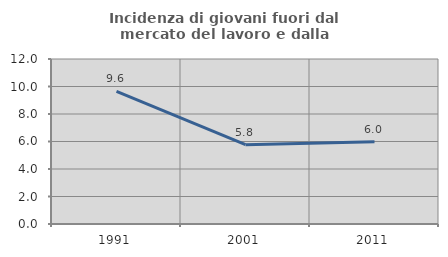
| Category | Incidenza di giovani fuori dal mercato del lavoro e dalla formazione  |
|---|---|
| 1991.0 | 9.641 |
| 2001.0 | 5.769 |
| 2011.0 | 5.983 |